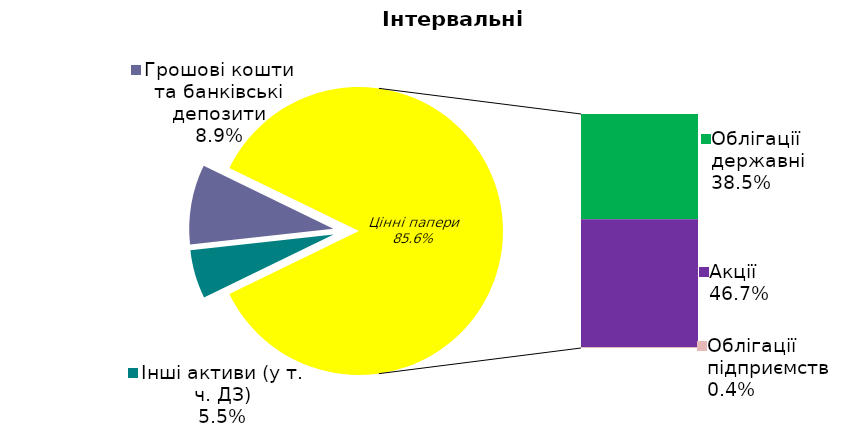
| Category | Series 0 |
|---|---|
| Інші активи (у т. ч. ДЗ) | 0.055 |
| Грошові кошти та банківські депозити | 0.089 |
| Банківські метали | 0 |
| Облігації державні  | 0.385 |
| Акції | 0.467 |
| Облігації підприємств | 0.004 |